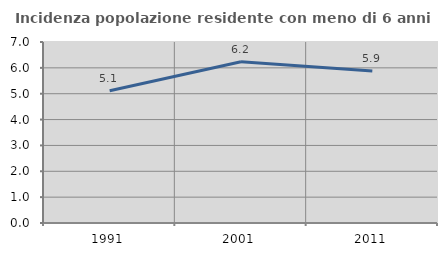
| Category | Incidenza popolazione residente con meno di 6 anni |
|---|---|
| 1991.0 | 5.118 |
| 2001.0 | 6.235 |
| 2011.0 | 5.875 |